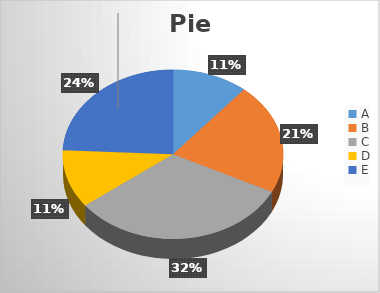
| Category | Value |
|---|---|
| A | 11 |
| B | 21 |
| C | 32 |
| D | 11 |
| E | 24 |